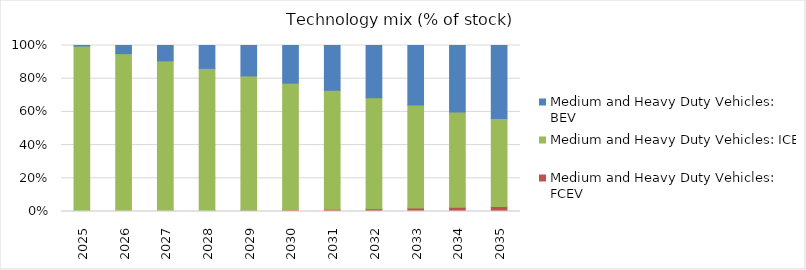
| Category | Medium and Heavy Duty Vehicles: FCEV | Medium and Heavy Duty Vehicles: ICE | Medium and Heavy Duty Vehicles: BEV |
|---|---|---|---|
| 2025.0 | 0.004 | 0.992 | 0.003 |
| 2026.0 | 0.004 | 0.947 | 0.049 |
| 2027.0 | 0.005 | 0.902 | 0.093 |
| 2028.0 | 0.006 | 0.856 | 0.138 |
| 2029.0 | 0.008 | 0.809 | 0.183 |
| 2030.0 | 0.011 | 0.763 | 0.227 |
| 2031.0 | 0.014 | 0.717 | 0.27 |
| 2032.0 | 0.017 | 0.668 | 0.315 |
| 2033.0 | 0.021 | 0.621 | 0.358 |
| 2034.0 | 0.025 | 0.575 | 0.4 |
| 2035.0 | 0.03 | 0.53 | 0.44 |